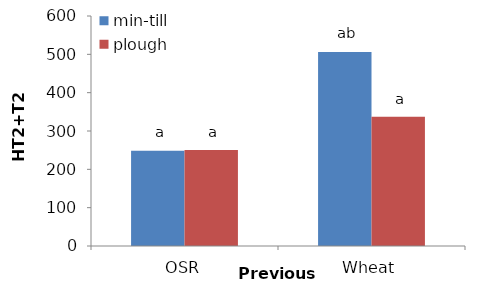
| Category | min-till | plough |
|---|---|---|
| OSR | 248.313 | 250.611 |
| Wheat | 505.825 | 337.287 |